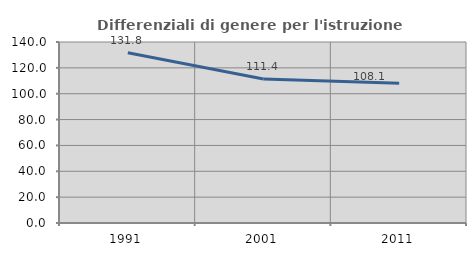
| Category | Differenziali di genere per l'istruzione superiore |
|---|---|
| 1991.0 | 131.758 |
| 2001.0 | 111.435 |
| 2011.0 | 108.15 |